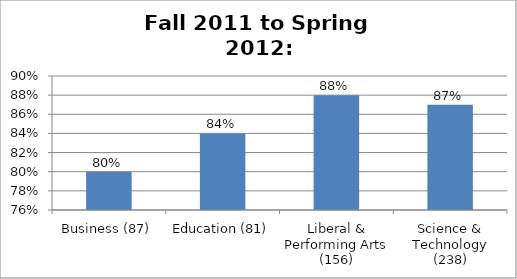
| Category | Series 0 |
|---|---|
| Business (87) | 0.8 |
| Education (81) | 0.84 |
| Liberal & Performing Arts (156) | 0.88 |
| Science & Technology (238) | 0.87 |